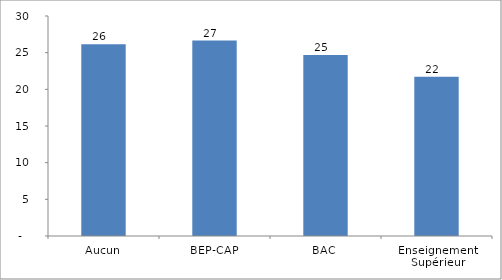
| Category | SEP scolaire |
|---|---|
| Aucun | 26.149 |
| BEP-CAP | 26.656 |
| BAC | 24.685 |
| Enseignement Supérieur | 21.705 |